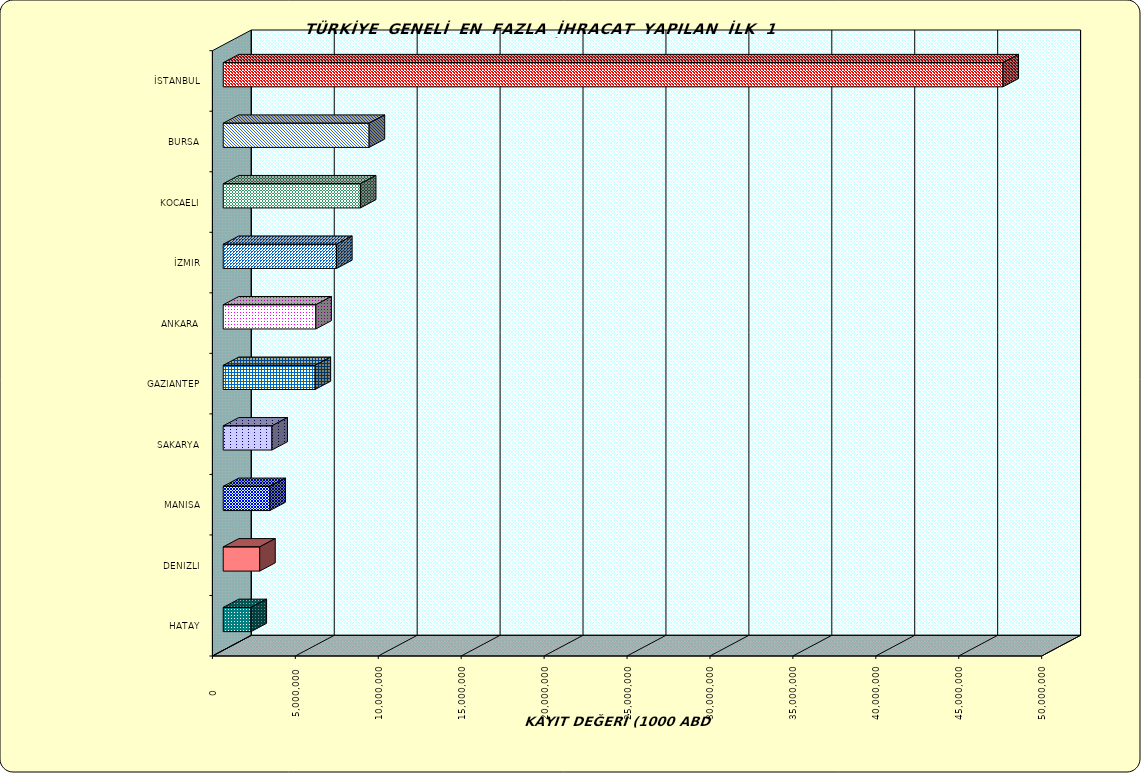
| Category | Series 0 |
|---|---|
| İSTANBUL | 47014258.7 |
| BURSA | 8797708.222 |
| KOCAELI | 8271372.805 |
| İZMIR | 6834905.191 |
| ANKARA | 5584525.856 |
| GAZIANTEP | 5539928.125 |
| SAKARYA | 2934710.109 |
| MANISA | 2813362.694 |
| DENIZLI | 2199438.621 |
| HATAY | 1676298.038 |